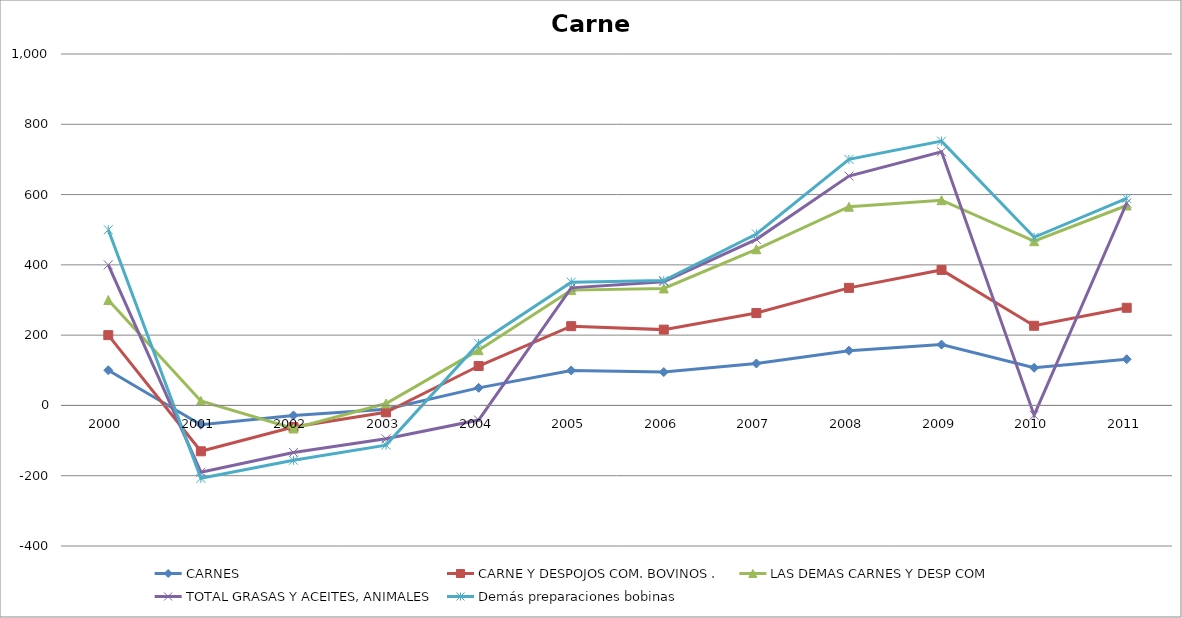
| Category | CARNES | CARNE Y DESPOJOS COM. BOVINOS . | LAS DEMAS CARNES Y DESP COM  | TOTAL GRASAS Y ACEITES, ANIMALES | Demás preparaciones bobinas |
|---|---|---|---|---|---|
| 2000 | 100 | 100 | 100 | 100 | 100 |
| 2001 | -54.877 | -75.66 | 12.791 | -59.512 | -17.434 |
| 2002 | -28.536 | -33.049 | -3.993 | -68.44 | -21.998 |
| 2003 | -10.553 | -9.085 | 5.541 | -75.29 | -18.01 |
| 2004 | 50.015 | 62.093 | 45.159 | -41.704 | 19.227 |
| 2005 | 99.497 | 126.032 | 102.578 | 6.532 | 16.129 |
| 2006 | 94.934 | 120.774 | 117.236 | 19.249 | 3.08 |
| 2007 | 119.385 | 143.492 | 181.449 | 28.274 | 15.211 |
| 2008 | 155.81 | 178.727 | 230.915 | 87.209 | 47.412 |
| 2009 | 173.037 | 212.53 | 198.494 | 137.835 | 30.199 |
| 2010 | 107.117 | 119.526 | 240.747 | -27.846 | 11.065 |
| 2011 | 131.428 | 146.457 | 290.973 | 7.091 | 12.979 |